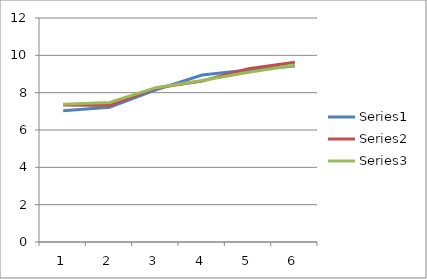
| Category | Series 0 | Series 1 | Series 2 |
|---|---|---|---|
| 0 | 7.033 | 7.34 | 7.377 |
| 1 | 7.22 | 7.319 | 7.477 |
| 2 | 8.152 | 8.246 | 8.268 |
| 3 | 8.947 | 8.622 | 8.653 |
| 4 | 9.211 | 9.284 | 9.093 |
| 5 | 9.432 | 9.627 | 9.469 |